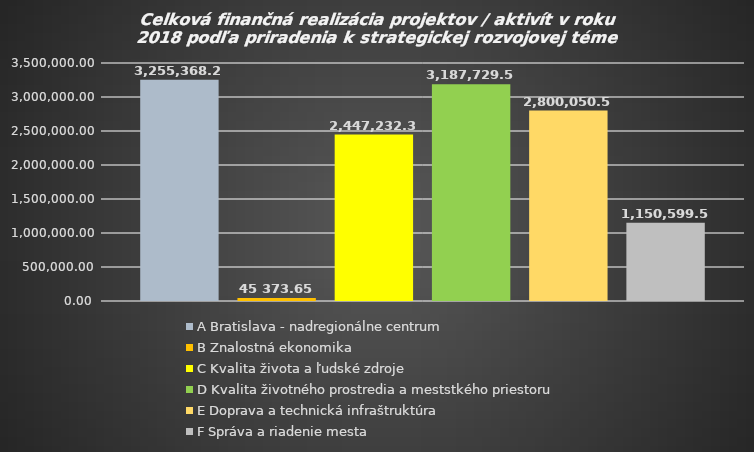
| Category | A | B | C | D | E | F |
|---|---|---|---|---|---|---|
| 0 | 3255368.2 | 45373.65 | 2447232.33 | 3187729.57 | 2800050.5 | 1150599.57 |